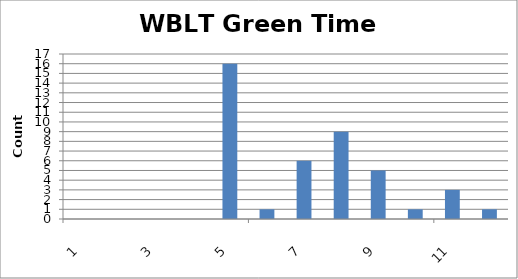
| Category | Series 0 |
|---|---|
| 0 | 0 |
| 1 | 0 |
| 2 | 0 |
| 3 | 0 |
| 4 | 16 |
| 5 | 1 |
| 6 | 6 |
| 7 | 9 |
| 8 | 5 |
| 9 | 1 |
| 10 | 3 |
| 11 | 1 |